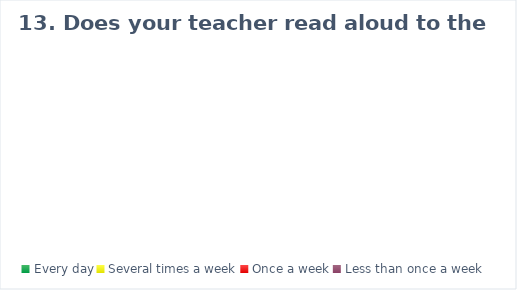
| Category | Series 0 |
|---|---|
| Every day | 0 |
| Several times a week | 0 |
| Once a week | 0 |
| Less than once a week | 0 |